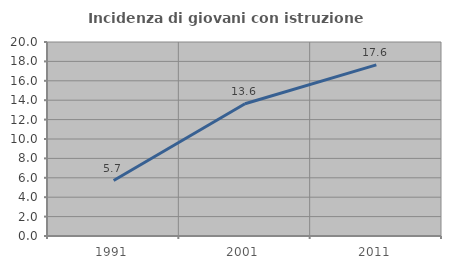
| Category | Incidenza di giovani con istruzione universitaria |
|---|---|
| 1991.0 | 5.714 |
| 2001.0 | 13.636 |
| 2011.0 | 17.647 |